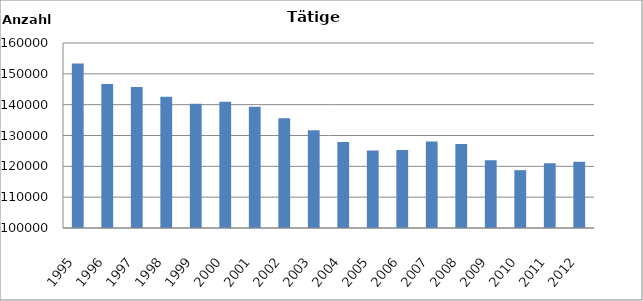
| Category | 1995 1996 1997 1998 1999 2000 2001 2002 2003 2004 2005 2006 2007 2008 2009 2010 2011 2012 |
|---|---|
| 1995 | 153384 |
| 1996 | 146742 |
| 1997 | 145717 |
| 1998 | 142598 |
| 1999 | 140319 |
| 2000 | 140983 |
| 2001 | 139341 |
| 2002 | 135596 |
| 2003 | 131743 |
| 2004 | 127904 |
| 2005 | 125099 |
| 2006 | 125327 |
| 2007 | 128030 |
| 2008 | 127238 |
| 2009 | 121954 |
| 2010 | 118762 |
| 2011 | 121003 |
| 2012 | 121500 |